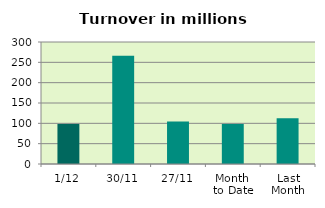
| Category | Series 0 |
|---|---|
| 1/12 | 98.535 |
| 30/11 | 266.248 |
| 27/11 | 104.249 |
| Month 
to Date | 98.535 |
| Last
Month | 112.501 |